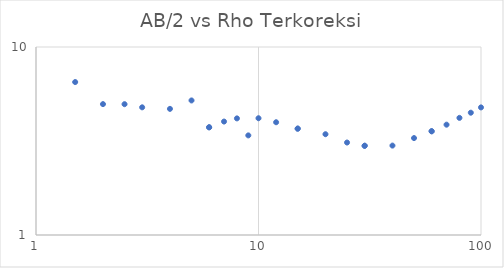
| Category | Series 0 |
|---|---|
| 1.5 | 6.51 |
| 2.0 | 4.968 |
| 2.5 | 4.964 |
| 3.0 | 4.777 |
| 4.0 | 4.687 |
| 5.0 | 5.196 |
| 6.0 | 3.74 |
| 6.0 | 3.74 |
| 7.0 | 4.013 |
| 8.0 | 4.171 |
| 9.0 | 3.387 |
| 10.0 | 4.179 |
| 12.0 | 3.979 |
| 15.0 | 3.68 |
| 15.0 | 3.68 |
| 20.0 | 3.437 |
| 25.0 | 3.104 |
| 30.0 | 2.983 |
| 30.0 | 2.983 |
| 40.0 | 2.99 |
| 50.0 | 3.278 |
| 60.0 | 3.563 |
| 60.0 | 3.563 |
| 70.0 | 3.862 |
| 80.0 | 4.198 |
| 90.0 | 4.472 |
| 100.0 | 4.772 |